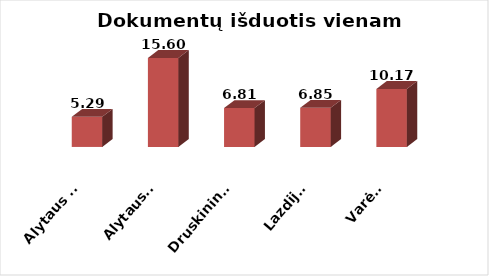
| Category | Series 0 |
|---|---|
| Alytaus m. | 5.286 |
| Alytaus r. | 15.596 |
| Druskininkai | 6.814 |
| Lazdijai | 6.854 |
| Varėna | 10.175 |